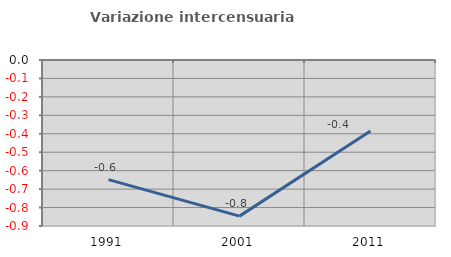
| Category | Variazione intercensuaria annua |
|---|---|
| 1991.0 | -0.648 |
| 2001.0 | -0.846 |
| 2011.0 | -0.385 |